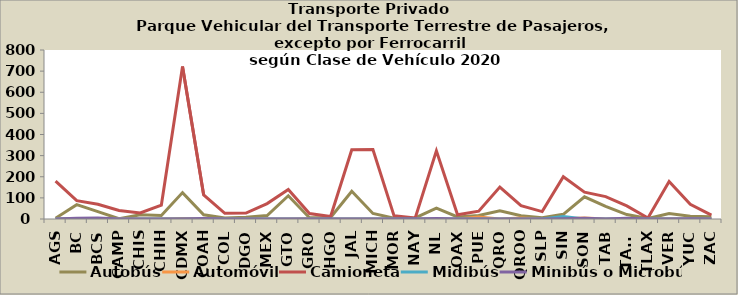
| Category | Autobús | Automóvil | Camioneta | Midibús | Minibús o Microbús |
|---|---|---|---|---|---|
| AGS | 4 | 0 | 179 | 0 | 0 |
| BC | 68 | 1 | 87 | 1 | 3 |
| BCS | 35 | 0 | 70 | 1 | 5 |
| CAMP | 1 | 2 | 40 | 0 | 0 |
| CHIS | 20 | 0 | 29 | 0 | 0 |
| CHIH | 17 | 0 | 66 | 0 | 0 |
| CDMX | 125 | 2 | 722 | 0 | 0 |
| COAH | 20 | 0 | 114 | 0 | 2 |
| COL | 5 | 0 | 27 | 0 | 0 |
| DGO | 8 | 0 | 28 | 0 | 0 |
| MEX | 16 | 0 | 73 | 0 | 0 |
| GTO | 110 | 0 | 140 | 0 | 0 |
| GRO | 6 | 1 | 26 | 0 | 0 |
| HGO | 7 | 0 | 12 | 0 | 0 |
| JAL | 131 | 0 | 328 | 0 | 0 |
| MICH | 26 | 0 | 329 | 0 | 0 |
| MOR | 4 | 0 | 15 | 0 | 0 |
| NAY | 5 | 0 | 5 | 0 | 0 |
| NL | 51 | 0 | 323 | 0 | 2 |
| OAX | 10 | 0 | 20 | 0 | 0 |
| PUE | 17 | 10 | 37 | 0 | 0 |
| QRO | 39 | 0 | 151 | 0 | 0 |
| QROO | 15 | 5 | 63 | 0 | 0 |
| SLP | 6 | 0 | 35 | 0 | 0 |
| SIN | 22 | 1 | 200 | 12 | 1 |
| SON | 105 | 5 | 127 | 0 | 4 |
| TAB | 60 | 0 | 106 | 0 | 0 |
| TAMS | 21 | 0 | 62 | 0 | 3 |
| TLAX | 2 | 0 | 5 | 0 | 0 |
| VER | 26 | 1 | 178 | 0 | 0 |
| YUC | 13 | 0 | 70 | 0 | 1 |
| ZAC | 11 | 0 | 18 | 0 | 0 |